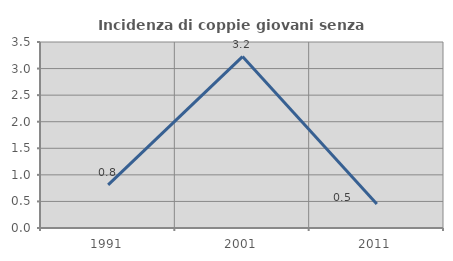
| Category | Incidenza di coppie giovani senza figli |
|---|---|
| 1991.0 | 0.813 |
| 2001.0 | 3.226 |
| 2011.0 | 0.45 |